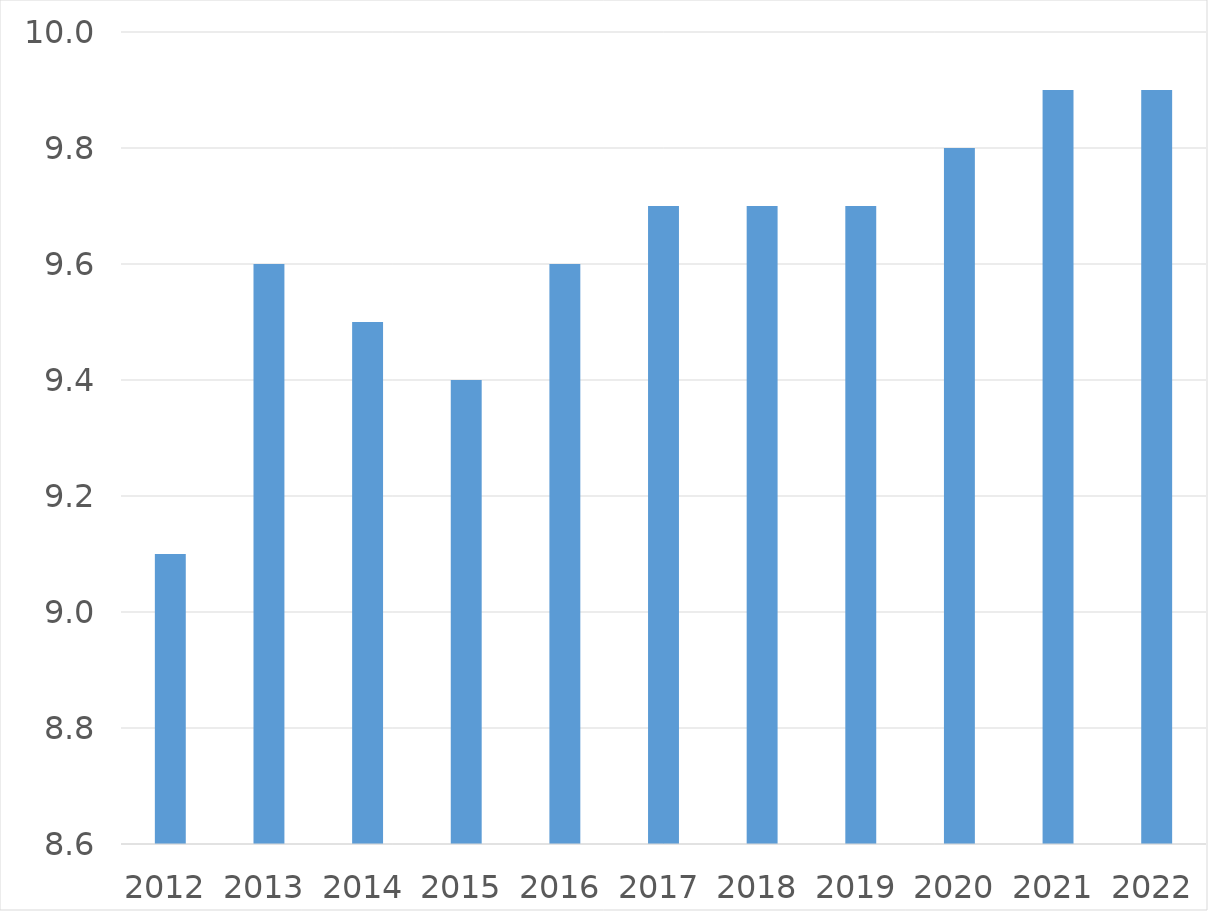
| Category | Series 0 |
|---|---|
| 2012 | 9.1 |
| 2013 | 9.6 |
| 2014 | 9.5 |
| 2015 | 9.4 |
| 2016 | 9.6 |
| 2017 | 9.7 |
| 2018 | 9.7 |
| 2019 | 9.7 |
| 2020 | 9.8 |
| 2021 | 9.9 |
| 2022 | 9.9 |